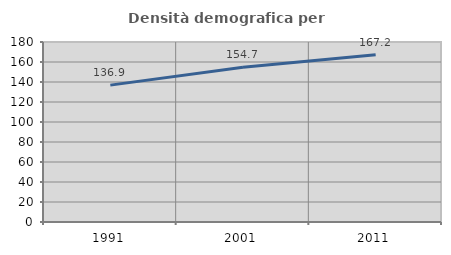
| Category | Densità demografica |
|---|---|
| 1991.0 | 136.865 |
| 2001.0 | 154.682 |
| 2011.0 | 167.185 |